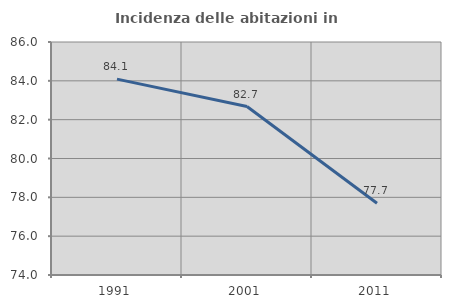
| Category | Incidenza delle abitazioni in proprietà  |
|---|---|
| 1991.0 | 84.088 |
| 2001.0 | 82.677 |
| 2011.0 | 77.691 |